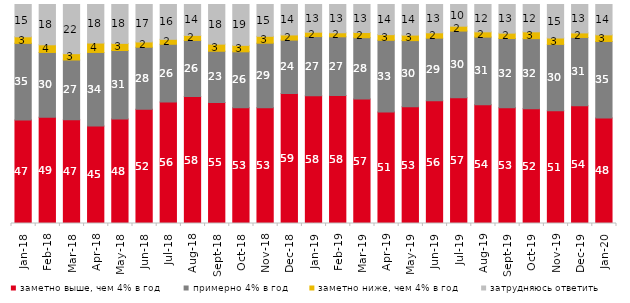
| Category | заметно выше, чем 4% в год | примерно 4% в год | заметно ниже, чем 4% в год | затрудняюсь ответить |
|---|---|---|---|---|
| 2018-01-01 | 47.25 | 35 | 3 | 14.75 |
| 2018-02-01 | 48.5 | 29.6 | 3.5 | 18.4 |
| 2018-03-01 | 47.4 | 27.25 | 2.9 | 22.45 |
| 2018-04-01 | 44.55 | 33.55 | 4.3 | 17.6 |
| 2018-05-01 | 47.7 | 31.3 | 3.25 | 17.75 |
| 2018-06-01 | 52.2 | 28.3 | 2.4 | 17.1 |
| 2018-07-01 | 55.5 | 26.35 | 2.25 | 15.9 |
| 2018-08-01 | 57.95 | 25.65 | 2.3 | 14.1 |
| 2018-09-01 | 55.3 | 23.35 | 3.25 | 18.1 |
| 2018-10-01 | 52.85 | 25.55 | 2.95 | 18.65 |
| 2018-11-01 | 52.844 | 29.491 | 3.144 | 14.521 |
| 2018-12-01 | 59.4 | 24.35 | 2.35 | 13.9 |
| 2019-01-01 | 58.3 | 27.05 | 2 | 12.65 |
| 2019-02-01 | 58.45 | 26.8 | 1.85 | 12.9 |
| 2019-03-01 | 56.887 | 27.946 | 2.387 | 12.78 |
| 2019-04-01 | 50.891 | 32.772 | 2.574 | 13.762 |
| 2019-05-01 | 53.343 | 30.163 | 2.526 | 13.967 |
| 2019-06-01 | 56.06 | 28.579 | 2.444 | 12.918 |
| 2019-07-01 | 57.475 | 30.396 | 2.228 | 9.901 |
| 2019-08-01 | 54.246 | 30.869 | 2.398 | 12.488 |
| 2019-09-01 | 52.822 | 31.634 | 2.475 | 13.069 |
| 2019-10-01 | 52.426 | 31.98 | 3.119 | 12.475 |
| 2019-11-01 | 51.485 | 30.297 | 2.921 | 15.297 |
| 2019-12-01 | 53.713 | 31.238 | 2.079 | 12.97 |
| 2020-01-01 | 48.119 | 35 | 3.02 | 13.861 |